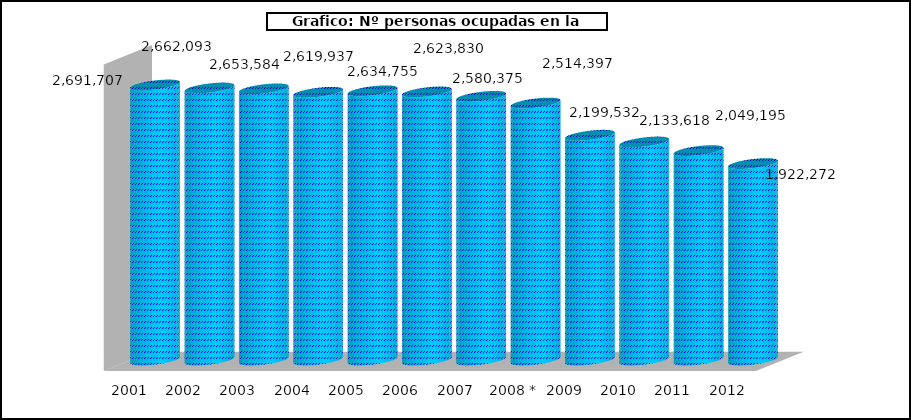
| Category |  Nº personas ocupadas |
|---|---|
| 2001 | 2691707 |
| 2002 | 2662093 |
| 2003 | 2653584 |
| 2004 | 2619937 |
| 2005 | 2634755 |
| 2006 | 2623830 |
| 2007 | 2580375 |
|  2008 * | 2514397 |
| 2009 | 2199532 |
| 2010 | 2133618 |
| 2011 | 2049195 |
| 2012 | 1922272 |